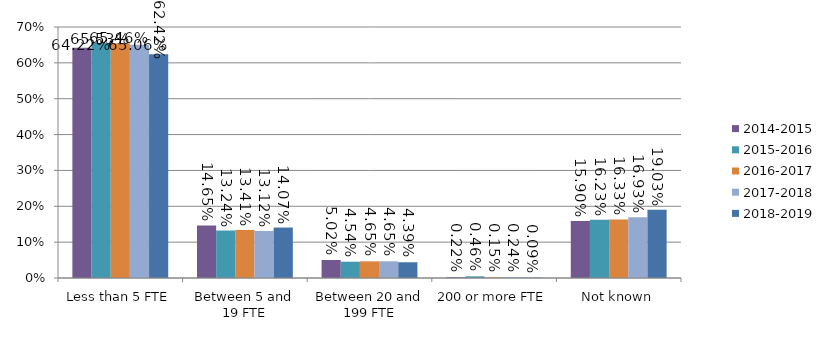
| Category | 2014-2015 | 2015-2016 | 2016-2017 | 2017-2018 | 2018-2019 |
|---|---|---|---|---|---|
| Less than 5 FTE | 0.642 | 0.655 | 0.655 | 0.651 | 0.624 |
| Between 5 and 19 FTE | 0.147 | 0.132 | 0.134 | 0.131 | 0.141 |
| Between 20 and 199 FTE | 0.05 | 0.045 | 0.046 | 0.046 | 0.044 |
| 200 or more FTE | 0.002 | 0.005 | 0.002 | 0.002 | 0.001 |
| Not known | 0.159 | 0.162 | 0.163 | 0.169 | 0.19 |